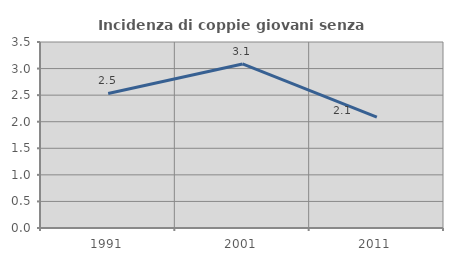
| Category | Incidenza di coppie giovani senza figli |
|---|---|
| 1991.0 | 2.532 |
| 2001.0 | 3.087 |
| 2011.0 | 2.087 |